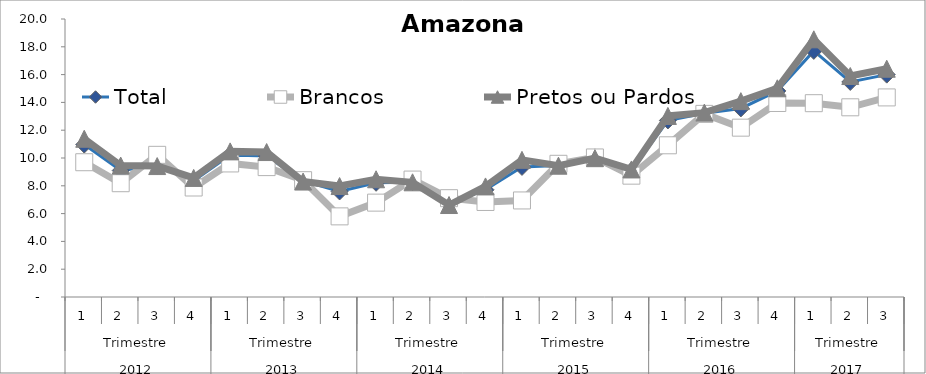
| Category | Total | Brancos | Pretos ou Pardos |
|---|---|---|---|
| 0 | 10.965 | 9.696 | 11.384 |
| 1 | 9.098 | 8.186 | 9.456 |
| 2 | 9.445 | 10.227 | 9.419 |
| 3 | 8.363 | 7.877 | 8.566 |
| 4 | 10.222 | 9.608 | 10.476 |
| 5 | 10.142 | 9.345 | 10.428 |
| 6 | 8.347 | 8.404 | 8.304 |
| 7 | 7.592 | 5.801 | 7.981 |
| 8 | 8.217 | 6.789 | 8.469 |
| 9 | 8.264 | 8.448 | 8.252 |
| 10 | 6.716 | 7.109 | 6.617 |
| 11 | 7.714 | 6.836 | 7.955 |
| 12 | 9.358 | 6.947 | 9.867 |
| 13 | 9.457 | 9.582 | 9.447 |
| 14 | 10.048 | 10.04 | 9.987 |
| 15 | 9.088 | 8.729 | 9.177 |
| 16 | 12.701 | 10.914 | 13.026 |
| 17 | 13.213 | 13.174 | 13.262 |
| 18 | 13.567 | 12.183 | 14.09 |
| 19 | 14.825 | 13.957 | 15.016 |
| 20 | 17.705 | 13.944 | 18.539 |
| 21 | 15.471 | 13.647 | 15.896 |
| 22 | 15.997 | 14.359 | 16.423 |